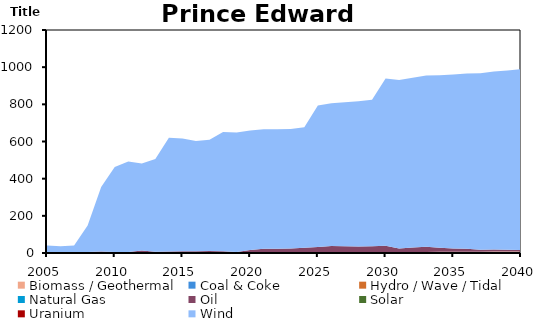
| Category | Biomass / Geothermal | Coal & Coke | Hydro / Wave / Tidal | Natural Gas | Oil | Solar | Uranium | Wind |
|---|---|---|---|---|---|---|---|---|
| 2005.0 | 0 | 0 | 0 | 0 | 0.879 | 0 | 0 | 40 |
| 2006.0 | 0 | 0 | 0 | 0 | 0.879 | 0 | 0 | 36 |
| 2007.0 | 0 | 0 | 0 | 0 | 0.879 | 0 | 0 | 40 |
| 2008.0 | 5 | 0 | 0 | 0 | 0.482 | 0 | 0 | 142 |
| 2009.0 | 5 | 0 | 0 | 0 | 2.721 | 0 | 0 | 347 |
| 2010.0 | 5 | 0 | 0 | 0 | 0 | 0 | 0 | 458 |
| 2011.0 | 5 | 0 | 0 | 0 | 0 | 0 | 0 | 488 |
| 2012.0 | 5 | 0 | 0 | 0 | 8.163 | 0 | 0 | 468 |
| 2013.0 | 5 | 0 | 0 | 0 | 2.168 | 0 | 0 | 499 |
| 2014.0 | 2.5 | 0 | 0 | 0 | 5.8 | 0 | 0 | 611.28 |
| 2015.0 | 2.6 | 0 | 0 | 0 | 7.3 | 0 | 0 | 606.094 |
| 2016.0 | 2.7 | 0 | 0 | 0 | 6.3 | 0 | 0 | 593.653 |
| 2017.0 | 2.7 | 0 | 0 | 0 | 8.1 | 0 | 0 | 598.312 |
| 2018.0 | 2.7 | 0 | 0 | 0 | 6.336 | 0 | 0 | 642.72 |
| 2019.0 | 2.7 | 0 | 0 | 0 | 3.155 | 0 | 0 | 642.72 |
| 2020.0 | 2.7 | 0 | 0 | 0 | 13.691 | 0 | 0 | 642.72 |
| 2021.0 | 2.7 | 0 | 0 | 0 | 20.118 | 0 | 0 | 642.72 |
| 2022.0 | 2.7 | 0 | 0 | 0 | 20.118 | 0 | 0 | 642.72 |
| 2023.0 | 2.7 | 0 | 0 | 0 | 22 | 0 | 0 | 642.72 |
| 2024.0 | 2.7 | 0 | 0 | 0 | 25 | 0 | 0 | 649.552 |
| 2025.0 | 2.7 | 0 | 0 | 0 | 30 | 0 | 0 | 761.33 |
| 2026.0 | 3.226 | 0 | 0 | 0 | 35 | 0 | 0 | 768.075 |
| 2027.0 | 3.751 | 0 | 0 | 0 | 33 | 0 | 0 | 774.82 |
| 2028.0 | 4.364 | 0 | 0 | 0 | 30 | 0 | 0 | 781.566 |
| 2029.0 | 4.89 | 0 | 0 | 0 | 31 | 0 | 0 | 788.398 |
| 2030.0 | 4.599 | 0 | 0 | 0 | 34 | 0 | 0 | 900.351 |
| 2031.0 | 5.027 | 0 | 0 | 0 | 19 | 0 | 0 | 907.272 |
| 2032.0 | 5.395 | 0 | 0 | 0 | 24 | 0 | 0 | 914.192 |
| 2033.0 | 5.824 | 0 | 0 | 0 | 28 | 0 | 0 | 921.288 |
| 2034.0 | 6.191 | 0 | 0 | 0 | 22 | 0 | 0 | 928.471 |
| 2035.0 | 6.191 | 0 | 0 | 0 | 18 | 0 | 0 | 935.742 |
| 2036.0 | 6.62 | 0 | 0 | 0 | 16 | 0 | 0 | 943.012 |
| 2037.0 | 7.049 | 0 | 0 | 0 | 10 | 0 | 0 | 950.458 |
| 2038.0 | 7.416 | 0 | 0 | 0 | 11 | 0 | 0 | 957.904 |
| 2039.0 | 7.845 | 0 | 0 | 0 | 9 | 0 | 0 | 965.438 |
| 2040.0 | 8.274 | 0 | 0 | 0 | 8 | 0 | 0 | 973.059 |